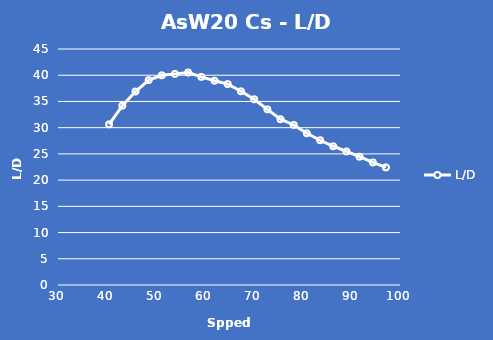
| Category | L/D |
|---|---|
| 40.470886862826355 | 30.637 |
| 43.16894598701478 | 34.188 |
| 45.867005111203206 | 36.892 |
| 48.56506423539163 | 39.062 |
| 51.26312335958006 | 39.983 |
| 53.961182483768475 | 40.258 |
| 56.6592416079569 | 40.509 |
| 59.357300732145326 | 39.683 |
| 62.05535985633375 | 38.957 |
| 64.75341898052217 | 38.314 |
| 67.4514781047106 | 36.939 |
| 70.14953722889902 | 35.403 |
| 72.84759635308744 | 33.482 |
| 75.54565547727587 | 31.617 |
| 78.24371460146429 | 30.513 |
| 80.94177372565271 | 28.935 |
| 83.63983284984114 | 27.6 |
| 86.33789197402956 | 26.455 |
| 89.03595109821799 | 25.463 |
| 91.73401022240641 | 24.467 |
| 94.43206934659483 | 23.371 |
| 97.13012847078326 | 22.422 |